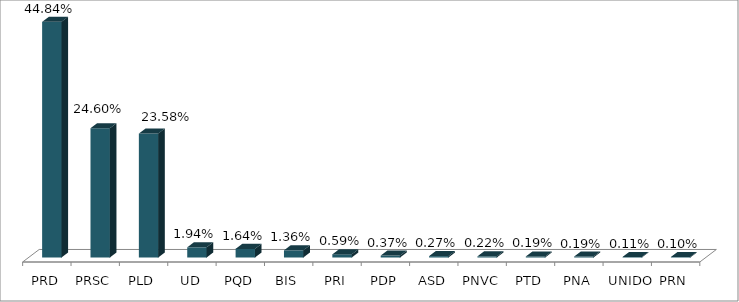
| Category | Votos % |
|---|---|
| PRD | 0.448 |
| PRSC | 0.246 |
| PLD | 0.236 |
| UD | 0.019 |
| PQD | 0.016 |
| BIS | 0.014 |
| PRI | 0.006 |
| PDP | 0.004 |
| ASD | 0.003 |
| PNVC | 0.002 |
| PTD | 0.002 |
| PNA | 0.002 |
| UNIDO | 0.001 |
| PRN | 0.001 |